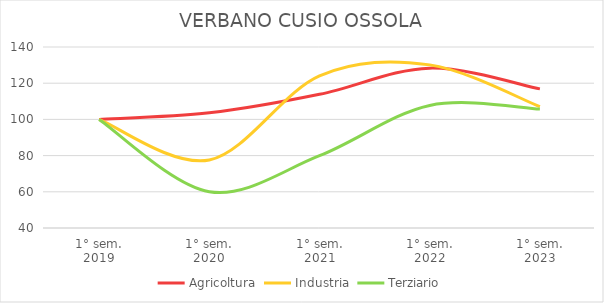
| Category | Agricoltura | Industria | Terziario |
|---|---|---|---|
| 1° sem.
2019 | 100 | 100 | 100 |
| 1° sem.
2020 | 103.614 | 77.564 | 60.082 |
| 1° sem.
2021 | 113.855 | 124.092 | 79.953 |
| 1° sem.
2022 | 128.313 | 130.128 | 107.73 |
| 1° sem.
2023 | 116.867 | 107.051 | 105.71 |